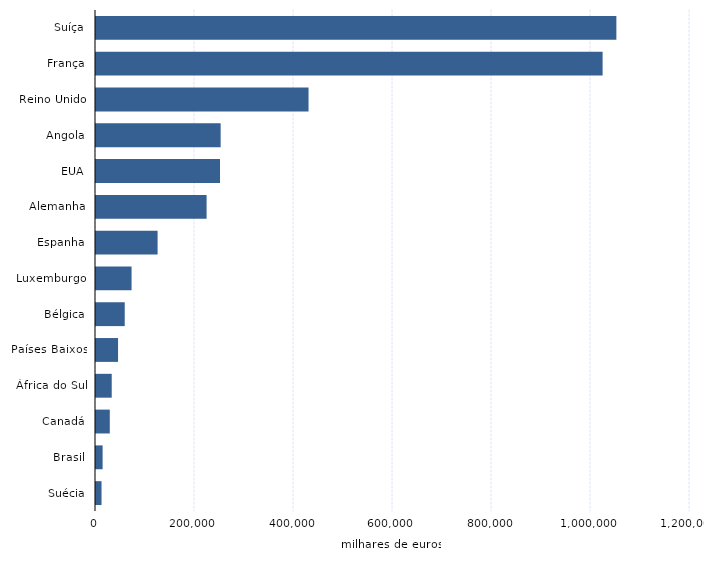
| Category | Series 2 |
|---|---|
| Suíça | 1051260 |
| França | 1023450 |
| Reino Unido | 429380 |
| Angola | 251820 |
| EUA | 250540 |
| Alemanha | 223440 |
| Espanha | 124440 |
| Luxemburgo | 71850 |
| Bélgica | 58050 |
| Países Baixos | 44560 |
| África do Sul | 31770 |
| Canadá | 27850 |
| Brasil | 13370 |
| Suécia | 11170 |